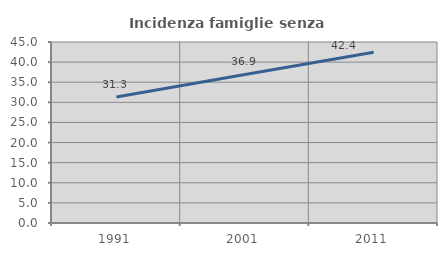
| Category | Incidenza famiglie senza nuclei |
|---|---|
| 1991.0 | 31.313 |
| 2001.0 | 36.941 |
| 2011.0 | 42.443 |